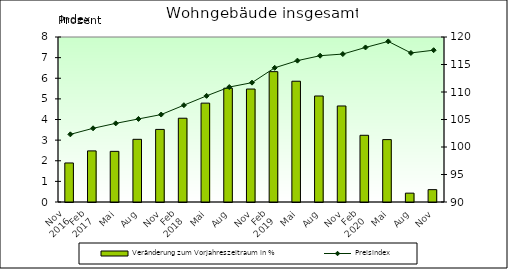
| Category | Veränderung zum Vorjahreszeitraum in % |
|---|---|
| 0 | 1.892 |
| 1 | 2.478 |
| 2 | 2.456 |
| 3 | 3.039 |
| 4 | 3.519 |
| 5 | 4.062 |
| 6 | 4.794 |
| 7 | 5.519 |
| 8 | 5.477 |
| 9 | 6.32 |
| 10 | 5.855 |
| 11 | 5.14 |
| 12 | 4.655 |
| 13 | 3.234 |
| 14 | 3.025 |
| 15 | 0.429 |
| 16 | 0.599 |